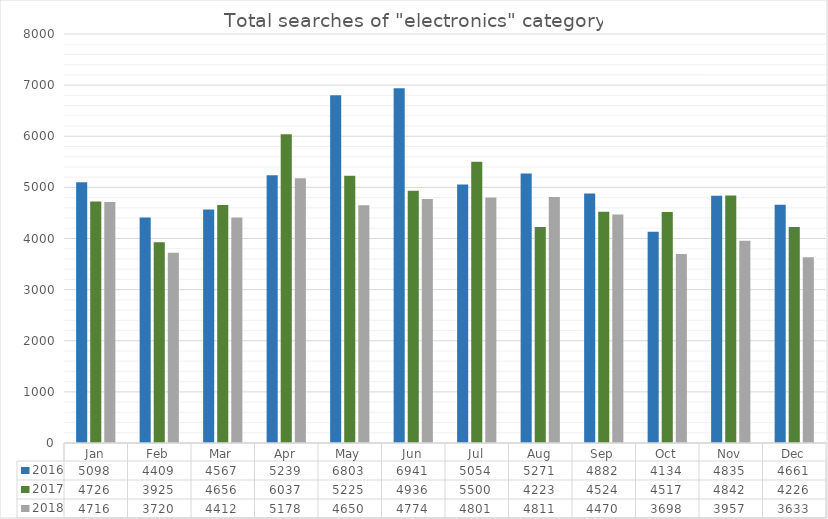
| Category | 2016 | 2017 | 2018 |
|---|---|---|---|
| Jan | 5098 | 4726 | 4716 |
| Feb | 4409 | 3925 | 3720 |
| Mar | 4567 | 4656 | 4412 |
| Apr | 5239 | 6037 | 5178 |
| May | 6803 | 5225 | 4650 |
| Jun | 6941 | 4936 | 4774 |
| Jul | 5054 | 5500 | 4801 |
| Aug | 5271 | 4223 | 4811 |
| Sep | 4882 | 4524 | 4470 |
| Oct | 4134 | 4517 | 3698 |
| Nov | 4835 | 4842 | 3957 |
| Dec | 4661 | 4226 | 3633 |